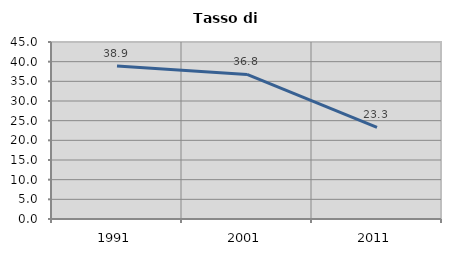
| Category | Tasso di disoccupazione   |
|---|---|
| 1991.0 | 38.919 |
| 2001.0 | 36.765 |
| 2011.0 | 23.281 |